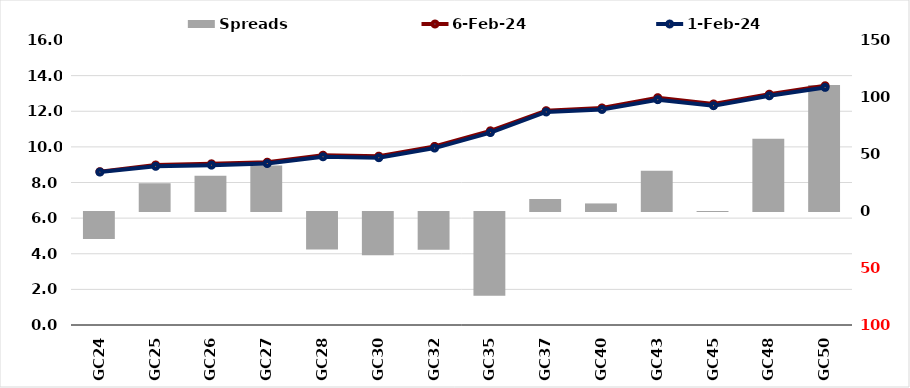
| Category |  Spreads   |
|---|---|
| GC24 | -23.636 |
| GC25 | 24.372 |
| GC26 | 30.998 |
| GC27 | 39.972 |
| GC28 | -32.839 |
| GC30 | -37.983 |
| GC32 | -33.199 |
| GC35 | -73.39 |
| GC37 | 10.594 |
| GC40 | 6.635 |
| GC43 | 35.363 |
| GC45 | -0.021 |
| GC48 | 63.42 |
| GC50 | 110.616 |